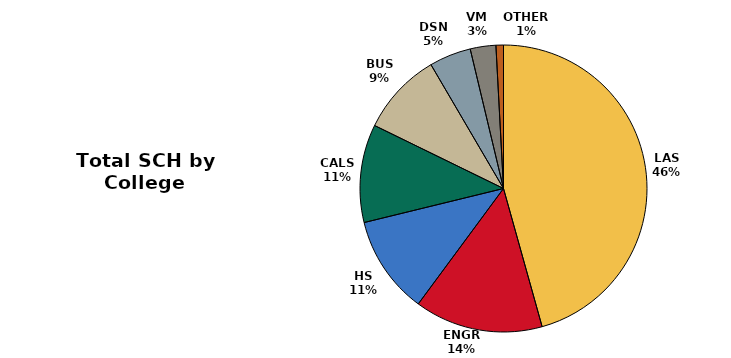
| Category | FY2019 |
|---|---|
| LAS | 440642.613 |
| ENGR | 139554.628 |
| HS | 106769.585 |
| CALS | 106615.017 |
| BUS | 90064.4 |
| DSN | 45393.566 |
| VM | 27855.391 |
| OTHER | 8143 |